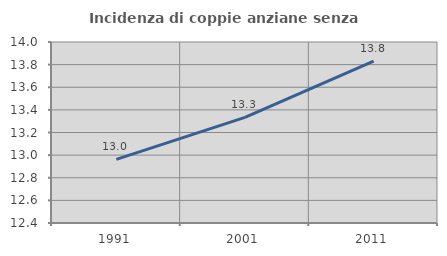
| Category | Incidenza di coppie anziane senza figli  |
|---|---|
| 1991.0 | 12.963 |
| 2001.0 | 13.333 |
| 2011.0 | 13.831 |